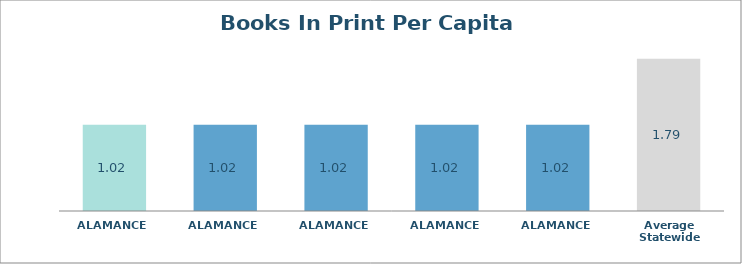
| Category | Series 0 |
|---|---|
| ALAMANCE  | 1.016 |
| ALAMANCE  | 1.016 |
| ALAMANCE  | 1.016 |
| ALAMANCE  | 1.016 |
| ALAMANCE  | 1.016 |
| Average Statewide | 1.792 |